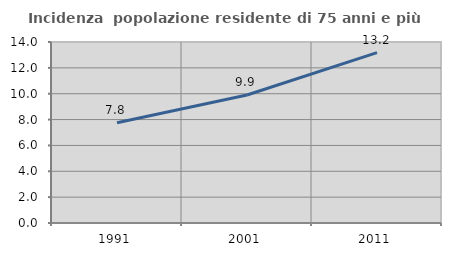
| Category | Incidenza  popolazione residente di 75 anni e più |
|---|---|
| 1991.0 | 7.758 |
| 2001.0 | 9.903 |
| 2011.0 | 13.176 |